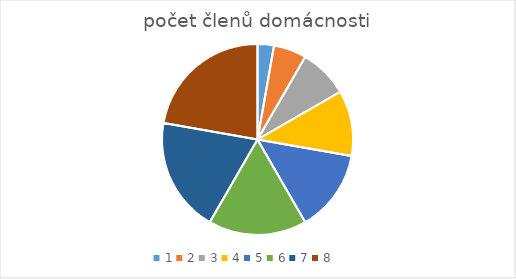
| Category | Series 0 | Series 1 |
|---|---|---|
| 0 | 1 | 7 |
| 1 | 2 | 59 |
| 2 | 3 | 27 |
| 3 | 4 | 13 |
| 4 | 5 | 10 |
| 5 | 6 | 10 |
| 6 | 7 | 5 |
| 7 | 8 | 12 |